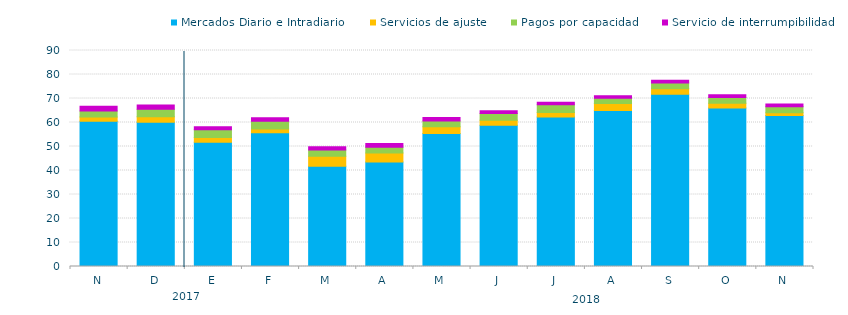
| Category | Mercados Diario e Intradiario  | Servicios de ajuste | Pagos por capacidad | Servicio de interrumpibilidad |
|---|---|---|---|---|
| N | 60.56 | 1.68 | 2.5 | 2.07 |
| D | 60.14 | 2.25 | 3.08 | 1.85 |
| E | 51.77 | 1.96 | 3.2 | 1.35 |
| F | 55.76 | 1.56 | 3.18 | 1.43 |
| M | 41.74 | 4.2 | 2.55 | 1.39 |
| A | 43.53 | 3.79 | 2.41 | 1.54 |
| M | 55.4 | 2.88 | 2.34 | 1.47 |
| J | 58.82 | 2.11 | 2.79 | 1.13 |
| J | 62.3 | 1.85 | 3.25 | 1.03 |
| A | 64.95 | 2.97 | 2.19 | 1.04 |
| S | 71.77 | 2.28 | 2.43 | 1.11 |
| O | 66.06 | 1.93 | 2.4 | 1.13 |
| N | 62.87 | 1.18 | 2.56 | 1.1 |